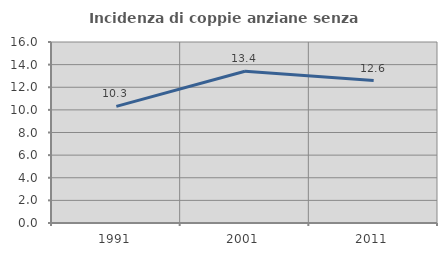
| Category | Incidenza di coppie anziane senza figli  |
|---|---|
| 1991.0 | 10.306 |
| 2001.0 | 13.41 |
| 2011.0 | 12.594 |